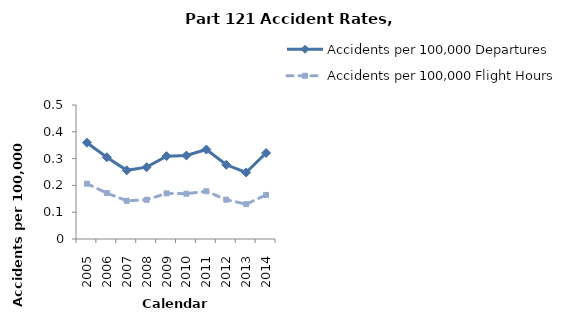
| Category | Accidents per 100,000 Departures | Accidents per 100,000 Flight Hours |
|---|---|---|
| 2005.0 | 0.359 | 0.206 |
| 2006.0 | 0.305 | 0.171 |
| 2007.0 | 0.256 | 0.143 |
| 2008.0 | 0.268 | 0.146 |
| 2009.0 | 0.309 | 0.17 |
| 2010.0 | 0.311 | 0.169 |
| 2011.0 | 0.334 | 0.178 |
| 2012.0 | 0.277 | 0.147 |
| 2013.0 | 0.248 | 0.13 |
| 2014.0 | 0.321 | 0.164 |